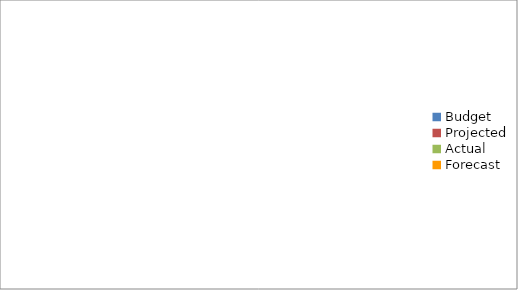
| Category | Series 0 |
|---|---|
| Budget | 1490 |
| Projected | 2150 |
| Actual | 3020 |
| Forecast | 1900 |